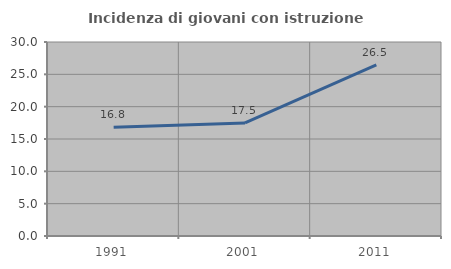
| Category | Incidenza di giovani con istruzione universitaria |
|---|---|
| 1991.0 | 16.832 |
| 2001.0 | 17.48 |
| 2011.0 | 26.459 |